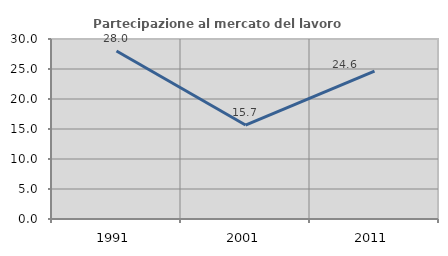
| Category | Partecipazione al mercato del lavoro  femminile |
|---|---|
| 1991.0 | 28.012 |
| 2001.0 | 15.655 |
| 2011.0 | 24.643 |